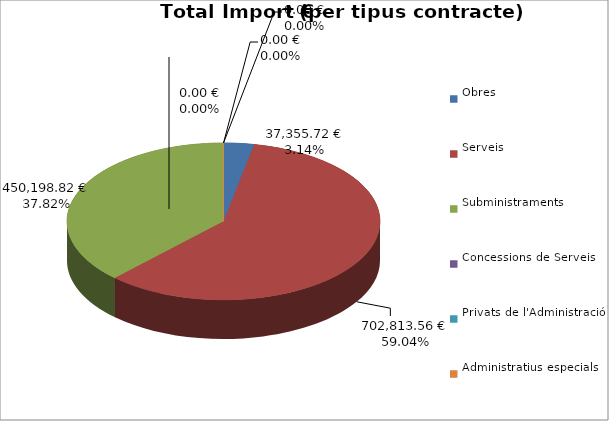
| Category | Total preu
(amb IVA) |
|---|---|
| Obres | 37355.72 |
| Serveis | 702813.56 |
| Subministraments | 450198.82 |
| Concessions de Serveis | 0 |
| Privats de l'Administració | 0 |
| Administratius especials | 0 |